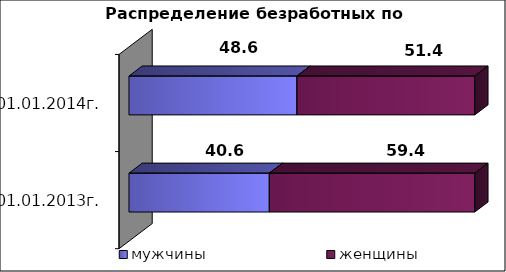
| Category | мужчины  | женщины  |
|---|---|---|
| на 01.01.2013г. | 40.6 | 59.4 |
| на 01.01.2014г. | 48.6 | 51.4 |